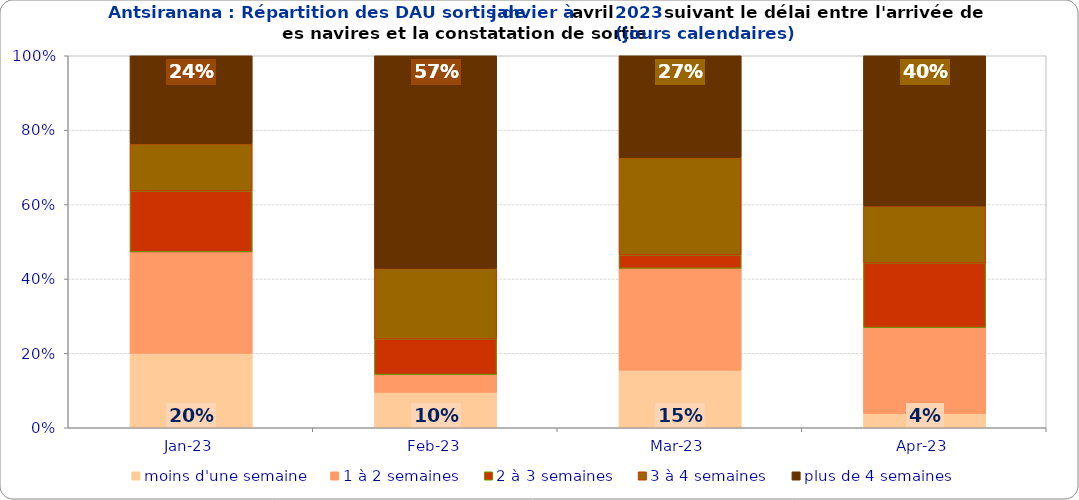
| Category | moins d'une semaine | 1 à 2 semaines | 2 à 3 semaines | 3 à 4 semaines | plus de 4 semaines |
|---|---|---|---|---|---|
| 2023-01-01 | 0.2 | 0.273 | 0.164 | 0.127 | 0.236 |
| 2023-02-01 | 0.095 | 0.048 | 0.095 | 0.19 | 0.571 |
| 2023-03-01 | 0.155 | 0.274 | 0.036 | 0.262 | 0.274 |
| 2023-04-01 | 0.038 | 0.231 | 0.173 | 0.154 | 0.404 |